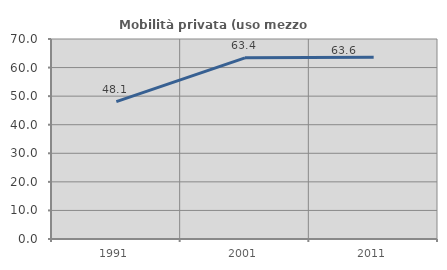
| Category | Mobilità privata (uso mezzo privato) |
|---|---|
| 1991.0 | 48.063 |
| 2001.0 | 63.398 |
| 2011.0 | 63.591 |